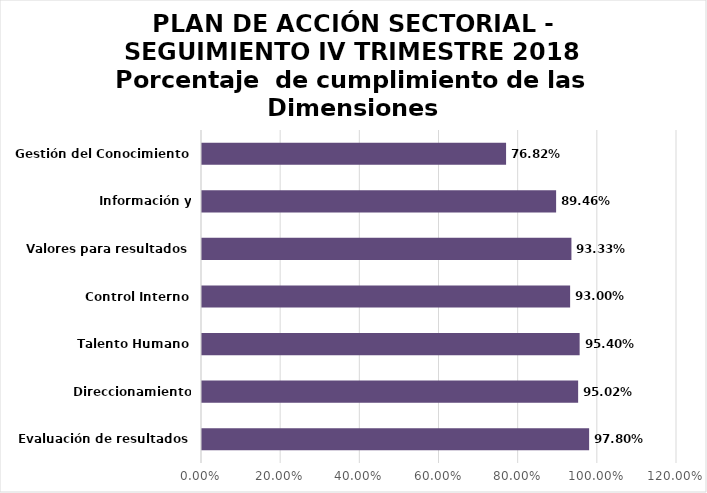
| Category | %  de cumplimiento |
|---|---|
| Evaluación de resultados | 0.978 |
| Direccionamiento Estratégico | 0.95 |
| Talento Humano | 0.954 |
| Control Interno | 0.93 |
| Valores para resultados | 0.933 |
| Información y Comunicación | 0.895 |
| Gestión del Conocimiento | 0.768 |